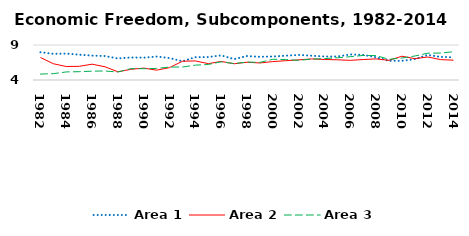
| Category | Area 1 | Area 2 | Area 3 |
|---|---|---|---|
| 1982.0 | 7.967 | 7.216 | 4.848 |
| 1983.0 | 7.738 | 6.322 | 4.907 |
| 1984.0 | 7.775 | 5.926 | 5.152 |
| 1985.0 | 7.618 | 5.955 | 5.188 |
| 1986.0 | 7.485 | 6.261 | 5.261 |
| 1987.0 | 7.422 | 5.891 | 5.287 |
| 1988.0 | 7.084 | 5.169 | 5.145 |
| 1989.0 | 7.215 | 5.525 | 5.624 |
| 1990.0 | 7.198 | 5.697 | 5.616 |
| 1991.0 | 7.348 | 5.406 | 5.653 |
| 1992.0 | 7.135 | 5.771 | 5.847 |
| 1993.0 | 6.672 | 6.678 | 5.856 |
| 1994.0 | 7.262 | 6.725 | 6.124 |
| 1995.0 | 7.278 | 6.341 | 6.214 |
| 1996.0 | 7.516 | 6.648 | 6.597 |
| 1997.0 | 6.988 | 6.318 | 6.347 |
| 1998.0 | 7.423 | 6.54 | 6.559 |
| 1999.0 | 7.314 | 6.432 | 6.515 |
| 2000.0 | 7.362 | 6.631 | 6.964 |
| 2001.0 | 7.472 | 6.755 | 6.921 |
| 2002.0 | 7.582 | 6.877 | 6.809 |
| 2003.0 | 7.471 | 7.013 | 6.979 |
| 2004.0 | 7.36 | 6.93 | 7.062 |
| 2005.0 | 7.354 | 6.888 | 7.172 |
| 2006.0 | 7.655 | 6.807 | 7.331 |
| 2007.0 | 7.58 | 6.924 | 7.509 |
| 2008.0 | 7.248 | 7.015 | 7.486 |
| 2009.0 | 6.743 | 6.812 | 6.955 |
| 2010.0 | 6.738 | 7.394 | 7.141 |
| 2011.0 | 6.978 | 7.049 | 7.425 |
| 2012.0 | 7.573 | 7.284 | 7.827 |
| 2013.0 | 7.3 | 6.914 | 7.853 |
| 2014.0 | 7.236 | 6.829 | 8.04 |